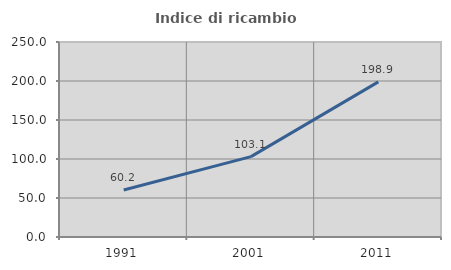
| Category | Indice di ricambio occupazionale  |
|---|---|
| 1991.0 | 60.174 |
| 2001.0 | 103.072 |
| 2011.0 | 198.913 |